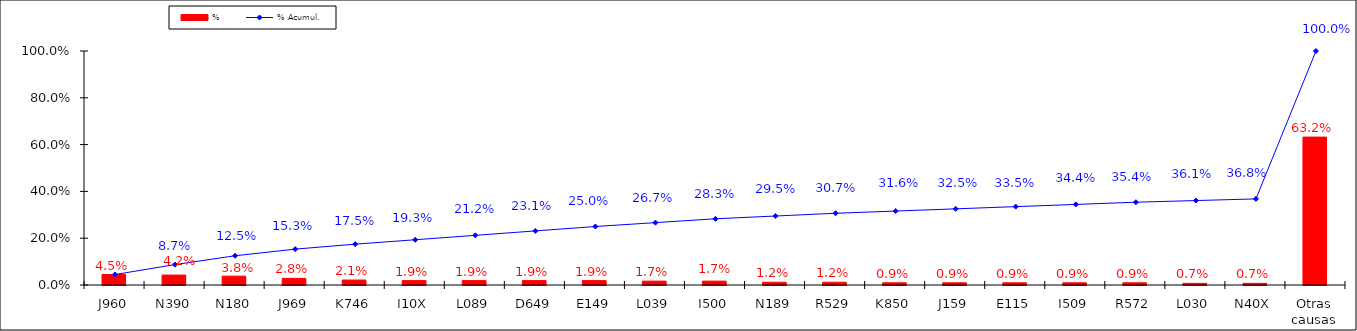
| Category | % |
|---|---|
| J960 | 0.045 |
| N390 | 0.042 |
| N180 | 0.038 |
| J969 | 0.028 |
| K746 | 0.021 |
| I10X | 0.019 |
| L089 | 0.019 |
| D649 | 0.019 |
| E149 | 0.019 |
| L039 | 0.017 |
| I500 | 0.017 |
| N189 | 0.012 |
| R529 | 0.012 |
| K850 | 0.009 |
| J159 | 0.009 |
| E115 | 0.009 |
| I509 | 0.009 |
| R572 | 0.009 |
| L030 | 0.007 |
| N40X | 0.007 |
| Otras causas | 0.632 |